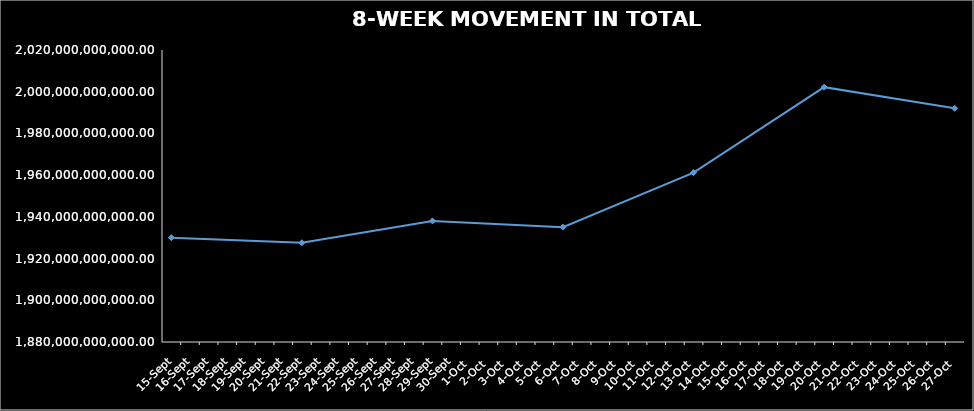
| Category | TOTAL NAV |
|---|---|
| 2023-09-15 | 1930034404358.771 |
| 2023-09-22 | 1927585637735.849 |
| 2023-09-29 | 1938057005087.285 |
| 2023-10-06 | 1935067759050.206 |
| 2023-10-13 | 1961229345082.933 |
| 2023-10-20 | 2002190167303.245 |
| 2023-10-27 | 1992052361749.948 |